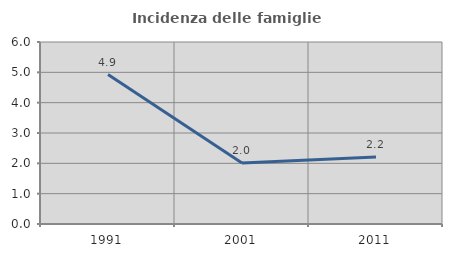
| Category | Incidenza delle famiglie numerose |
|---|---|
| 1991.0 | 4.926 |
| 2001.0 | 2.01 |
| 2011.0 | 2.212 |